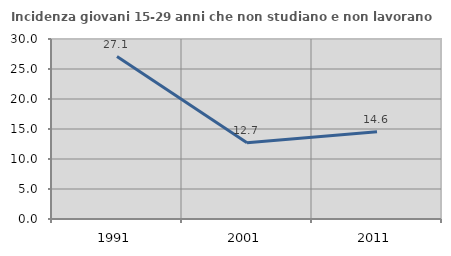
| Category | Incidenza giovani 15-29 anni che non studiano e non lavorano  |
|---|---|
| 1991.0 | 27.083 |
| 2001.0 | 12.689 |
| 2011.0 | 14.559 |